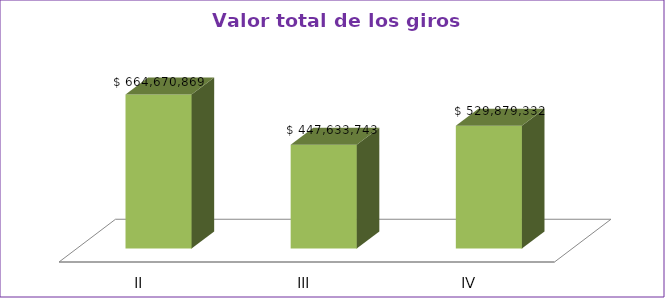
| Category | Series 0 |
|---|---|
| II | 664670869 |
| III | 447633743 |
| IV | 529879332 |